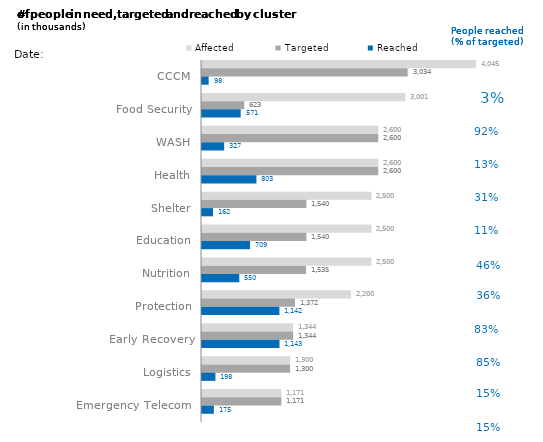
| Category | Affected | Targeted | Reached | %reached vs targeted |
|---|---|---|---|---|
| CCCM | 4045 | 3034 | 98 | 0.032 |
| Food Security | 3001 | 623 | 571 | 0.917 |
| WASH | 2600 | 2600 | 327 | 0.126 |
| Health | 2600 | 2600 | 803 | 0.309 |
| Shelter | 2500 | 1540 | 162 | 0.105 |
| Education | 2500 | 1540 | 709 | 0.46 |
| Nutrition | 2500 | 1535 | 550 | 0.358 |
| Protection | 2200 | 1372 | 1142 | 0.832 |
| Early Recovery | 1344 | 1344 | 1143 | 0.85 |
| Logistics | 1300 | 1300 | 198 | 0.152 |
| Emergency Telecom. | 1171 | 1171 | 175 | 0.149 |